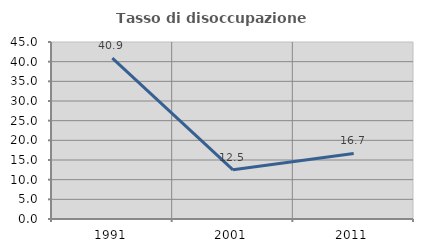
| Category | Tasso di disoccupazione giovanile  |
|---|---|
| 1991.0 | 40.909 |
| 2001.0 | 12.5 |
| 2011.0 | 16.667 |